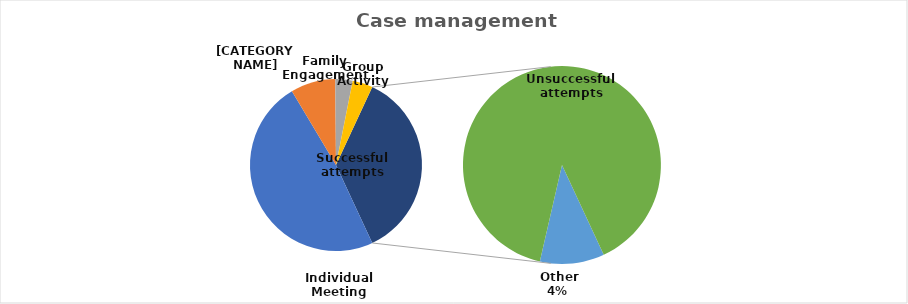
| Category | Series 0 |
|---|---|
| Individual Meeting | 178 |
| Referral/Linkage Accompaniment | 31 |
| Group Activity | 12 |
| Family Engagement | 14 |
|  Other | 14 |
| Unsuccessful attempts | 119 |